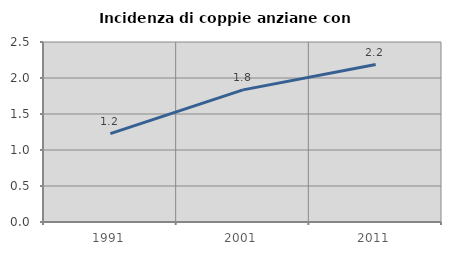
| Category | Incidenza di coppie anziane con figli |
|---|---|
| 1991.0 | 1.228 |
| 2001.0 | 1.835 |
| 2011.0 | 2.187 |